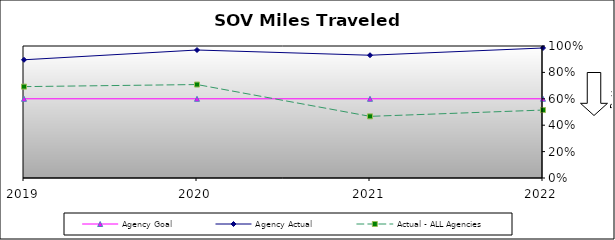
| Category | Agency Goal | Agency Actual | Actual - ALL Agencies |
|---|---|---|---|
| 2019.0 | 0.6 | 0.896 | 0.692 |
| 2020.0 | 0.6 | 0.97 | 0.708 |
| 2021.0 | 0.6 | 0.93 | 0.467 |
| 2022.0 | 0.6 | 0.985 | 0.515 |